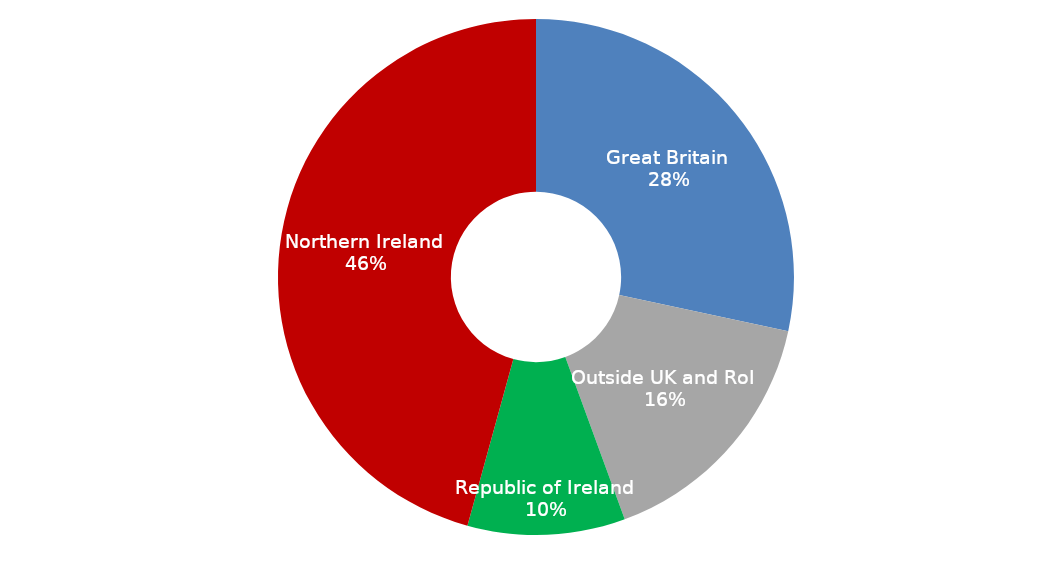
| Category | Series 0 |
|---|---|
| Great Britain  | 1373379.827 |
| Outside UK and RoI  | 776274.004 |
| Republic of Ireland  | 477731 |
| Northern Ireland  | 2212827.259 |